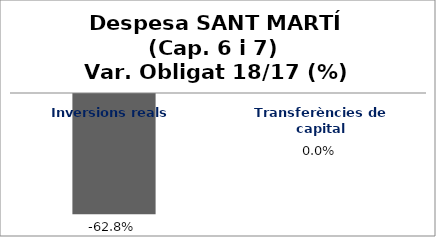
| Category | Series 0 |
|---|---|
| Inversions reals | -0.628 |
| Transferències de capital | 0 |